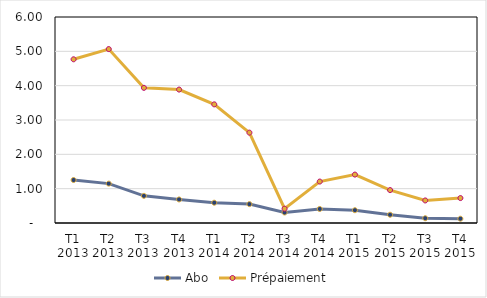
| Category | Abo | Prépaiement |
|---|---|---|
| T1 2013 | 1.252 | 4.768 |
| T2 2013 | 1.147 | 5.066 |
| T3 2013 | 0.79 | 3.937 |
| T4 2013 | 0.686 | 3.886 |
| T1 2014 | 0.591 | 3.456 |
| T2 2014 | 0.55 | 2.632 |
| T3 2014 | 0.306 | 0.416 |
| T4 2014 | 0.409 | 1.207 |
| T1 2015 | 0.373 | 1.41 |
| T2 2015 | 0.24 | 0.958 |
| T3 2015 | 0.139 | 0.657 |
| T4 2015 | 0.125 | 0.726 |